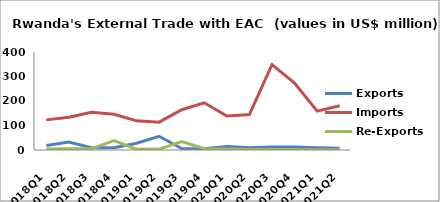
| Category | Exports | Imports | Re-Exports |
|---|---|---|---|
| 2018Q1 | 18.608 | 122.951 | 4.57 |
| 2018Q2 | 32.909 | 133.823 | 4.622 |
| 2018Q3 | 9.064 | 153.831 | 4.747 |
| 2018Q4 | 8.931 | 145.657 | 38.097 |
| 2019Q1 | 27.532 | 118.895 | 2.571 |
| 2019Q2 | 55.968 | 113.561 | 3.654 |
| 2019Q3 | 6.192 | 164.3 | 34.329 |
| 2019Q4 | 5.149 | 192.569 | 5.268 |
| 2020Q1 | 14.209 | 138.663 | 3.748 |
| 2020Q2 | 8.786 | 144.885 | 1.712 |
| 2020Q3 | 11.767 | 348.723 | 1.141 |
| 2020Q4 | 12.136 | 273.335 | 0.92 |
| 2021Q1 | 9.302 | 158.626 | 0.693 |
| 2021Q2 | 7.396 | 180.858 | 1.076 |